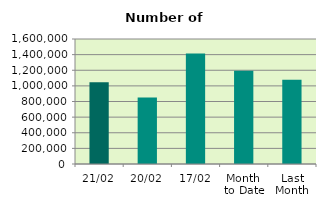
| Category | Series 0 |
|---|---|
| 21/02 | 1045444 |
| 20/02 | 850124 |
| 17/02 | 1412920 |
| Month 
to Date | 1194406.267 |
| Last
Month | 1077187.636 |